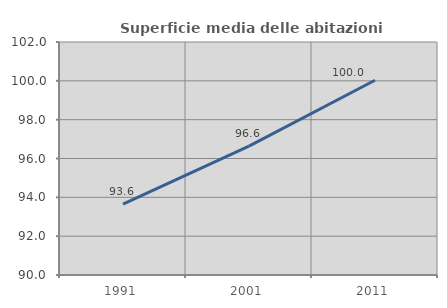
| Category | Superficie media delle abitazioni occupate |
|---|---|
| 1991.0 | 93.648 |
| 2001.0 | 96.638 |
| 2011.0 | 100.032 |